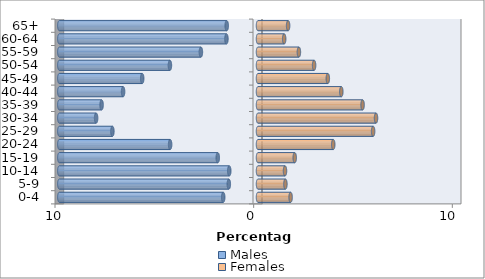
| Category | Males | Females |
|---|---|---|
| 0-4 | -1.751 | 1.641 |
| 5-9 | -1.469 | 1.38 |
| 10-14 | -1.446 | 1.359 |
| 15-19 | -2.025 | 1.849 |
| 20-24 | -4.423 | 3.788 |
| 25-29 | -7.329 | 5.795 |
| 30-34 | -8.149 | 5.941 |
| 35-39 | -7.874 | 5.265 |
| 40-44 | -6.791 | 4.194 |
| 45-49 | -5.829 | 3.515 |
| 50-54 | -4.434 | 2.824 |
| 55-59 | -2.874 | 2.059 |
| 60-64 | -1.589 | 1.318 |
| 65+ | -1.575 | 1.516 |